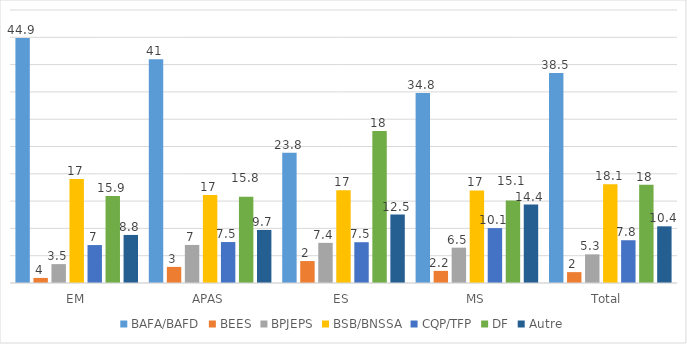
| Category | BAFA/BAFD | BEES | BPJEPS | BSB/BNSSA | CQP/TFP | DF | Autre |
|---|---|---|---|---|---|---|---|
| EM | 44.88 | 0.93 | 3.46 | 19.05 | 6.95 | 15.92 | 8.8 |
| APAS | 40.96 | 2.95 | 6.97 | 16.12 | 7.5 | 15.79 | 9.72 |
| ES | 23.84 | 4.02 | 7.35 | 16.97 | 7.47 | 27.83 | 12.53 |
| MS | 34.8 | 2.22 | 6.47 | 16.95 | 10.05 | 15.13 | 14.37 |
| Total  | 38.48 | 1.99 | 5.25 | 18.07 | 7.83 | 18 | 10.38 |